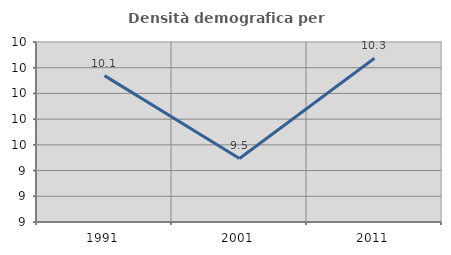
| Category | Densità demografica |
|---|---|
| 1991.0 | 10.139 |
| 2001.0 | 9.494 |
| 2011.0 | 10.274 |